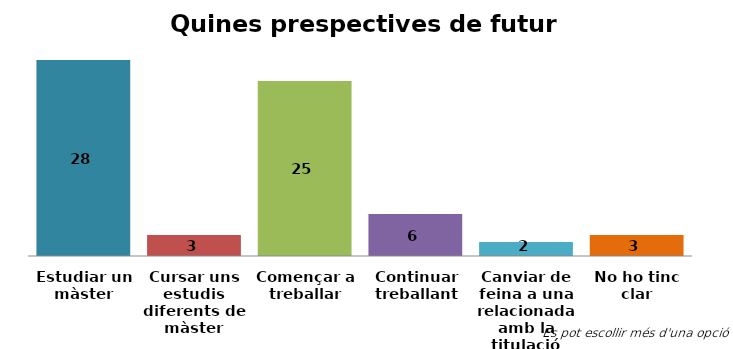
| Category | EPSEVG |
|---|---|
| Estudiar un màster | 28 |
| Cursar uns estudis diferents de màster | 3 |
| Començar a treballar | 25 |
| Continuar treballant | 6 |
| Canviar de feina a una relacionada amb la titulació | 2 |
| No ho tinc clar | 3 |